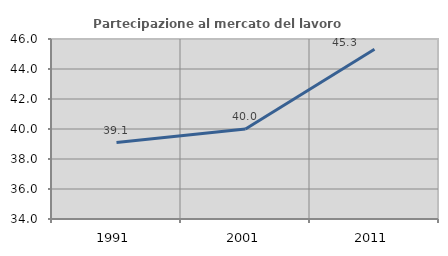
| Category | Partecipazione al mercato del lavoro  femminile |
|---|---|
| 1991.0 | 39.1 |
| 2001.0 | 40 |
| 2011.0 | 45.312 |